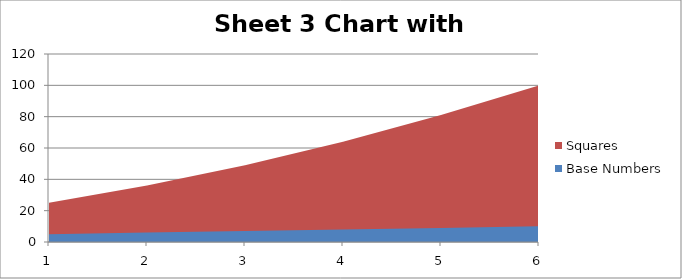
| Category | Squares | Base Numbers |
|---|---|---|
| 0 | 25 | 5 |
| 1 | 36 | 6 |
| 2 | 49 | 7 |
| 3 | 64 | 8 |
| 4 | 81 | 9 |
| 5 | 100 | 10 |